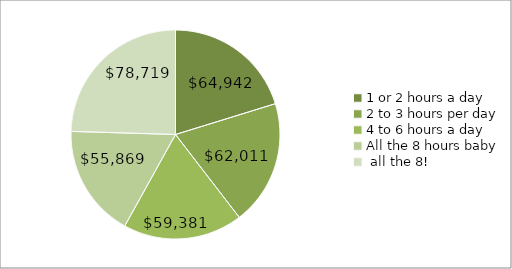
| Category | Total |
|---|---|
| 1 or 2 hours a day | 64941.672 |
| 2 to 3 hours per day | 62010.57 |
| 4 to 6 hours a day | 59380.658 |
| All the 8 hours baby, all the 8! | 55869.188 |
| Excel ?!? What Excel? | 78719.306 |